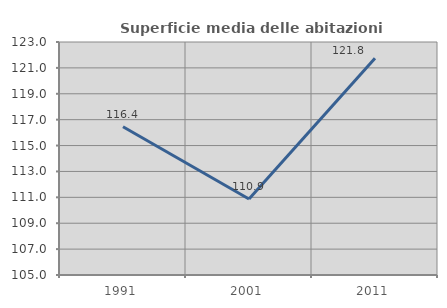
| Category | Superficie media delle abitazioni occupate |
|---|---|
| 1991.0 | 116.45 |
| 2001.0 | 110.873 |
| 2011.0 | 121.752 |